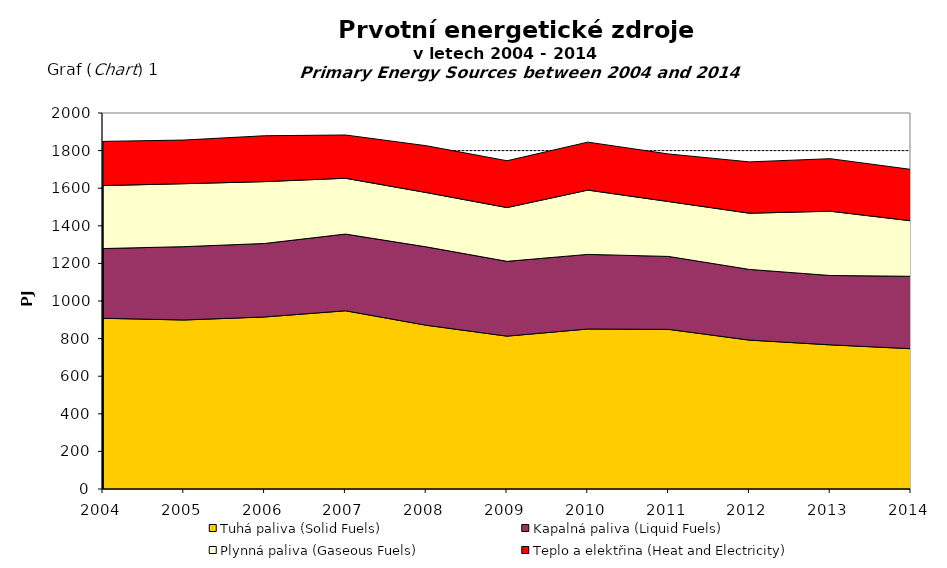
| Category | Tuhá paliva (Solid Fuels) | Kapalná paliva (Liquid Fuels) | Plynná paliva (Gaseous Fuels) | Teplo a elektřina (Heat and Electricity) |
|---|---|---|---|---|
| 2004.0 | 908 | 371 | 335 | 235 |
| 2005.0 | 899 | 390 | 335 | 232 |
| 2006.0 | 915 | 391 | 329 | 244 |
| 2007.0 | 948 | 408 | 297 | 230 |
| 2008.0 | 871 | 417 | 289 | 249 |
| 2009.0 | 813 | 398 | 286 | 249 |
| 2010.0 | 851 | 397 | 342 | 255 |
| 2011.0 | 849 | 388 | 292 | 253 |
| 2012.0 | 792 | 376 | 299 | 273 |
| 2013.0 | 766.781 | 368.878 | 341.952 | 279.373 |
| 2014.0 | 746.313 | 385.118 | 295.062 | 273.364 |